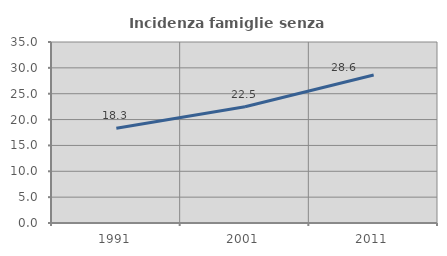
| Category | Incidenza famiglie senza nuclei |
|---|---|
| 1991.0 | 18.327 |
| 2001.0 | 22.489 |
| 2011.0 | 28.632 |